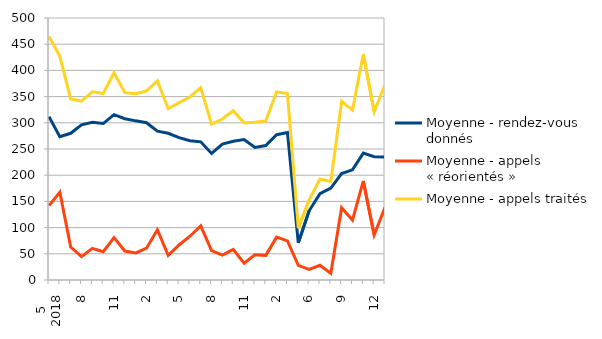
| Category | Moyenne - rendez-vous donnés | Moyenne - appels « réorientés » | Moyenne - appels traités |
|---|---|---|---|
| 0 | 311.765 | 142 | 464.882 |
| 1 | 273.455 | 167.455 | 427 |
| 2 | 280 | 62.875 | 345.562 |
| 3 | 296.19 | 44.524 | 341.524 |
| 4 | 300.8 | 60.3 | 359.15 |
| 5 | 298.591 | 54.091 | 355.864 |
| 6 | 315.476 | 80.81 | 395.571 |
| 7 | 307.867 | 55.333 | 357.6 |
| 8 | 303.727 | 51.773 | 355.5 |
| 9 | 300.111 | 60.722 | 360.833 |
| 10 | 284 | 95.857 | 379.857 |
| 11 | 280 | 46.9 | 326.9 |
| 12 | 271.625 | 66.875 | 338.5 |
| 13 | 265.722 | 83.556 | 349.278 |
| 14 | 263.652 | 103.261 | 366.913 |
| 15 | 241.5 | 56 | 297.5 |
| 16 | 259.55 | 47.65 | 307.2 |
| 17 | 264.818 | 58.364 | 323.182 |
| 18 | 267.889 | 31.944 | 299.833 |
| 19 | 252.944 | 48 | 300.944 |
| 20 | 256.682 | 47 | 303.682 |
| 21 | 277.3 | 81.85 | 359.15 |
| 22 | 281.308 | 74.538 | 355.846 |
| 23 | 70.875 | 27.938 | 98.812 |
| 24 | 132.095 | 20.429 | 152.524 |
| 25 | 164.714 | 28.048 | 192.762 |
| 26 | 175.476 | 12.667 | 188.143 |
| 27 | 203 | 138 | 341 |
| 28 | 210.227 | 114.091 | 324.318 |
| 29 | 242.15 | 189 | 431.15 |
| 30 | 235.227 | 85.818 | 321.045 |
| 31 | 234.429 | 138.571 | 373 |